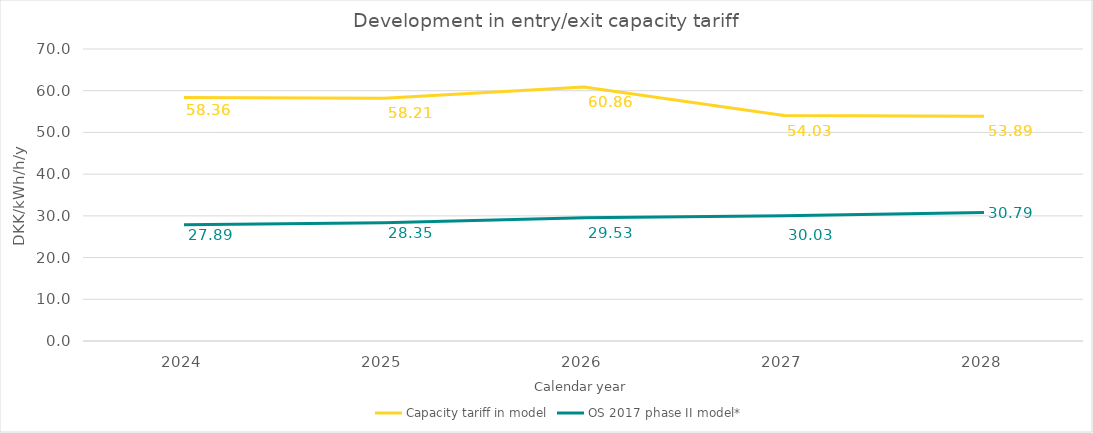
| Category | Capacity tariff in model | OS 2017 phase II model* |
|---|---|---|
| 2024.0 | 58.363 | 27.893 |
| 2025.0 | 58.212 | 28.349 |
| 2026.0 | 60.864 | 29.527 |
| 2027.0 | 54.032 | 30.033 |
| 2028.0 | 53.894 | 30.794 |